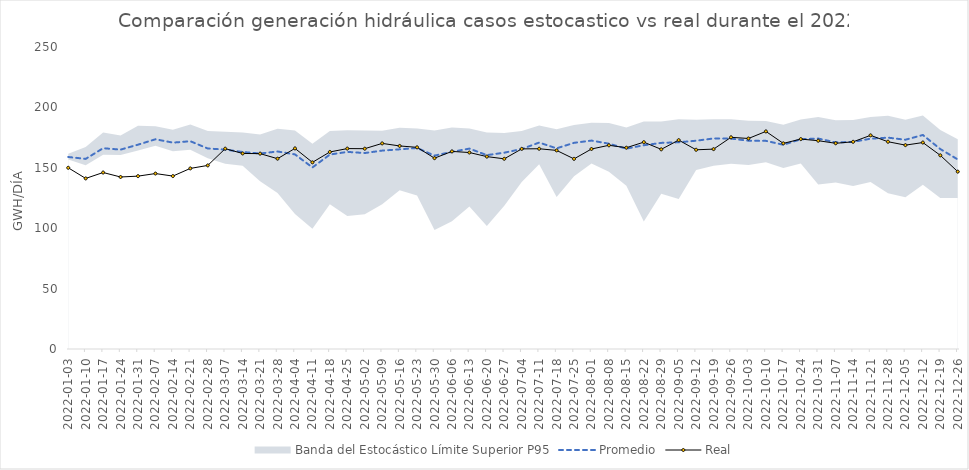
| Category | Promedio | Real |
|---|---|---|
| 2022-01-03 | 158.952 | 150.008 |
| 2022-01-10 | 157.383 | 141.195 |
| 2022-01-17 | 166.217 | 146.084 |
| 2022-01-24 | 165.052 | 142.385 |
| 2022-01-31 | 169.145 | 143.103 |
| 2022-02-07 | 173.622 | 145.237 |
| 2022-02-14 | 170.838 | 143.148 |
| 2022-02-21 | 171.992 | 149.491 |
| 2022-02-28 | 165.985 | 151.962 |
| 2022-03-07 | 165.082 | 165.83 |
| 2022-03-14 | 163.069 | 161.864 |
| 2022-03-21 | 161.837 | 161.734 |
| 2022-03-28 | 163.493 | 157.533 |
| 2022-04-04 | 161.087 | 166.064 |
| 2022-04-11 | 150.287 | 154.515 |
| 2022-04-18 | 160.963 | 163.116 |
| 2022-04-25 | 163.174 | 165.911 |
| 2022-05-02 | 162.225 | 165.811 |
| 2022-05-09 | 164.239 | 170.206 |
| 2022-05-16 | 165.283 | 168.094 |
| 2022-05-23 | 166.417 | 166.941 |
| 2022-05-30 | 160.078 | 157.98 |
| 2022-06-06 | 163.214 | 163.572 |
| 2022-06-13 | 165.89 | 162.634 |
| 2022-06-20 | 160.486 | 159.274 |
| 2022-06-27 | 162.517 | 157.439 |
| 2022-07-04 | 165.565 | 165.657 |
| 2022-07-11 | 170.882 | 165.763 |
| 2022-07-18 | 166.106 | 164.391 |
| 2022-07-25 | 170.668 | 157.386 |
| 2022-08-01 | 172.531 | 165.567 |
| 2022-08-08 | 169.965 | 168.621 |
| 2022-08-15 | 165.844 | 166.632 |
| 2022-08-22 | 168.679 | 171.216 |
| 2022-08-29 | 170.615 | 165.283 |
| 2022-09-05 | 171.126 | 172.916 |
| 2022-09-12 | 172.411 | 164.91 |
| 2022-09-19 | 174.285 | 165.46 |
| 2022-09-26 | 174.175 | 175.247 |
| 2022-10-03 | 172.424 | 174.26 |
| 2022-10-10 | 172.297 | 180.125 |
| 2022-10-17 | 169.061 | 170.228 |
| 2022-10-24 | 173.632 | 173.766 |
| 2022-10-31 | 174.22 | 172.437 |
| 2022-11-07 | 171.041 | 170.284 |
| 2022-11-14 | 171.462 | 171.52 |
| 2022-11-21 | 174.089 | 176.862 |
| 2022-11-28 | 174.959 | 171.58 |
| 2022-12-05 | 173.234 | 168.77 |
| 2022-12-12 | 177.15 | 170.91 |
| 2022-12-19 | 165.513 | 160.318 |
| 2022-12-26 | 156.919 | 146.81 |